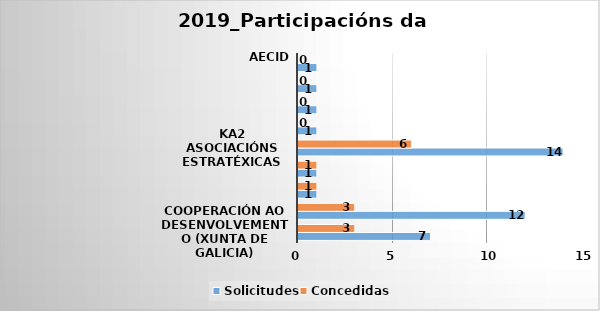
| Category | Solicitudes | Concedidas |
|---|---|---|
| Cooperación ao desenvolvemento (Xunta de Galicia) | 7 | 3 |
| Erasmus+ CBHE Capacity Building | 12 | 3 |
| Erasmus+ KA3 Social Inclusion and Common Values: the contribution in the field of education and training | 1 | 1 |
| Jean Monnet | 1 | 1 |
| KA2 asociacións estratéxicas | 14 | 6 |
| European Universities | 1 | 0 |
| H2020-GERI-2015-1 | 1 | 0 |
| Erasmus Mundus Joint Master degree | 1 | 0 |
| AECID | 1 | 0 |